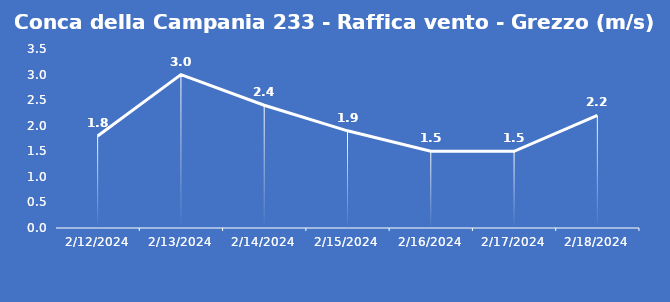
| Category | Conca della Campania 233 - Raffica vento - Grezzo (m/s) |
|---|---|
| 2/12/24 | 1.8 |
| 2/13/24 | 3 |
| 2/14/24 | 2.4 |
| 2/15/24 | 1.9 |
| 2/16/24 | 1.5 |
| 2/17/24 | 1.5 |
| 2/18/24 | 2.2 |